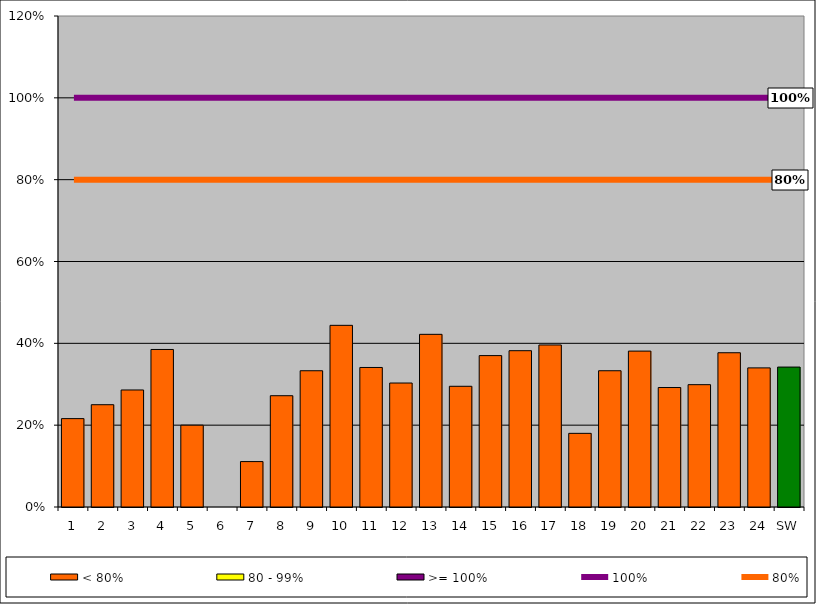
| Category | < 80% | 80 - 99% | >= 100% |
|---|---|---|---|
| 1 | 0.216 | 0 | 0 |
| 2 | 0.25 | 0 | 0 |
| 3 | 0.286 | 0 | 0 |
| 4 | 0.385 | 0 | 0 |
| 5 | 0.2 | 0 | 0 |
| 6 | 0 | 0 | 0 |
| 7 | 0.111 | 0 | 0 |
| 8 | 0.272 | 0 | 0 |
| 9 | 0.333 | 0 | 0 |
| 10 | 0.444 | 0 | 0 |
| 11 | 0.341 | 0 | 0 |
| 12 | 0.303 | 0 | 0 |
| 13 | 0.422 | 0 | 0 |
| 14 | 0.295 | 0 | 0 |
| 15 | 0.37 | 0 | 0 |
| 16 | 0.382 | 0 | 0 |
| 17 | 0.396 | 0 | 0 |
| 18 | 0.18 | 0 | 0 |
| 19 | 0.333 | 0 | 0 |
| 20 | 0.381 | 0 | 0 |
| 21 | 0.292 | 0 | 0 |
| 22 | 0.299 | 0 | 0 |
| 23 | 0.377 | 0 | 0 |
| 24 | 0.34 | 0 | 0 |
| SW | 0.342 | 0 | 0 |